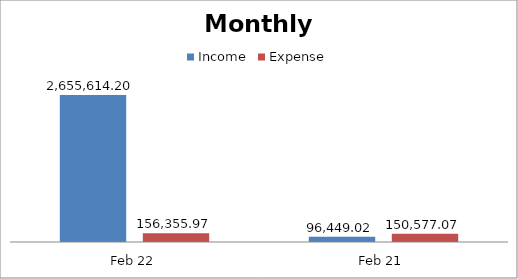
| Category | Income | Expense |
|---|---|---|
| Feb 22 | 2655614.2 | 156355.97 |
| Feb 21 | 96449.02 | 150577.07 |